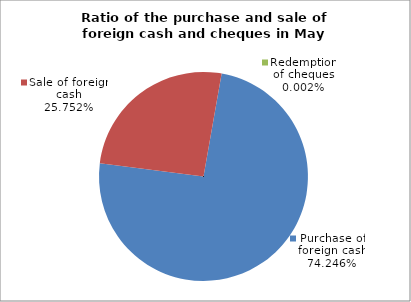
| Category | Purchase of foreign cash |
|---|---|
| 0 | 0.742 |
| 1 | 0.258 |
| 2 | 0 |